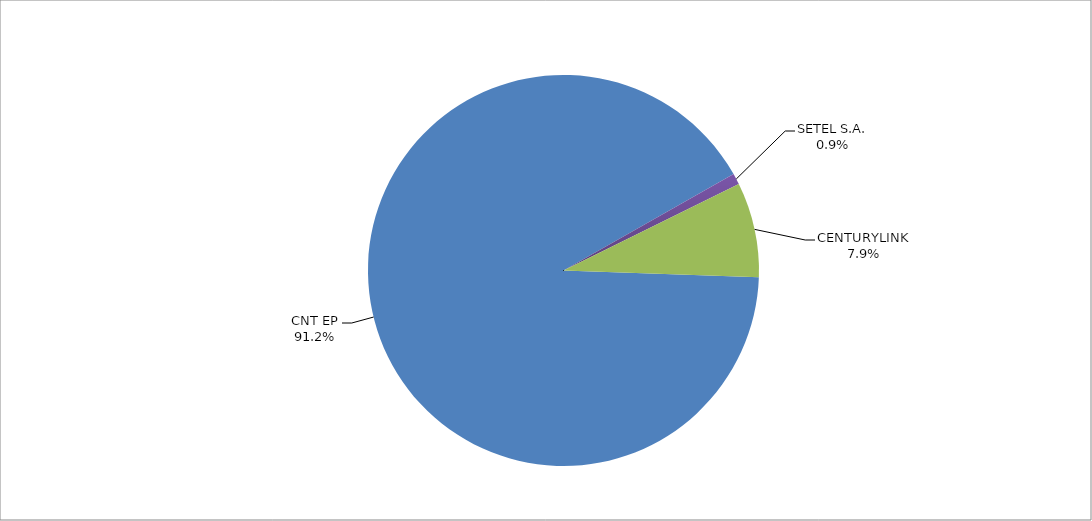
| Category | Series 0 |
|---|---|
| CNT EP | 302 |
| SETEL S.A. | 3 |
| CENTURYLINK | 26 |